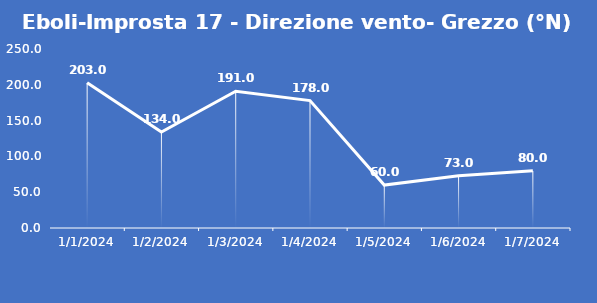
| Category | Eboli-Improsta 17 - Direzione vento- Grezzo (°N) |
|---|---|
| 1/1/24 | 203 |
| 1/2/24 | 134 |
| 1/3/24 | 191 |
| 1/4/24 | 178 |
| 1/5/24 | 60 |
| 1/6/24 | 73 |
| 1/7/24 | 80 |